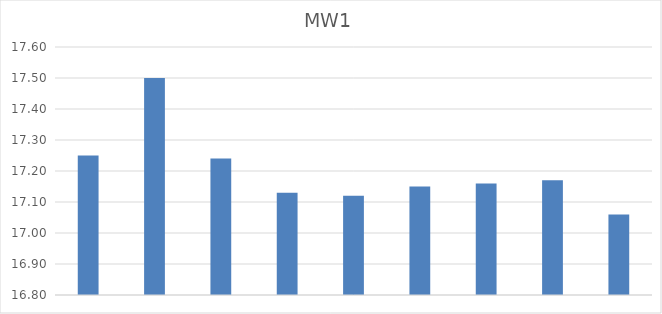
| Category | MW1 |
|---|---|
|  | 17.25 |
|  | 17.5 |
|  | 17.24 |
|  | 17.13 |
|  | 17.12 |
|  | 17.15 |
|  | 17.16 |
|  | 17.17 |
|  | 17.06 |